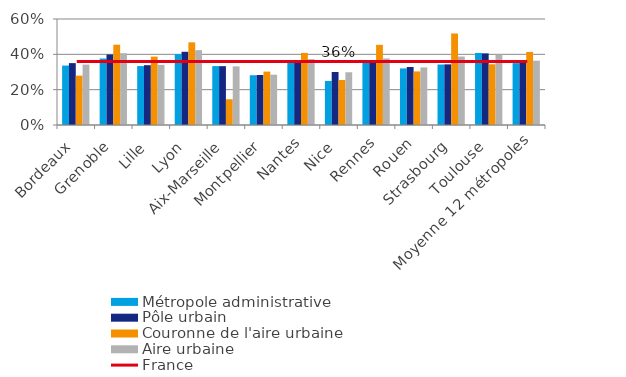
| Category | Métropole administrative | Pôle urbain | Couronne de l'aire urbaine | Aire urbaine |
|---|---|---|---|---|
| Bordeaux | 0.336 | 0.35 | 0.279 | 0.342 |
| Grenoble | 0.376 | 0.399 | 0.454 | 0.406 |
| Lille | 0.334 | 0.339 | 0.387 | 0.34 |
| Lyon | 0.401 | 0.414 | 0.468 | 0.424 |
| Aix-Marseille | 0.333 | 0.333 | 0.146 | 0.332 |
| Montpellier | 0.282 | 0.283 | 0.302 | 0.285 |
| Nantes | 0.366 | 0.366 | 0.408 | 0.373 |
| Nice | 0.249 | 0.3 | 0.255 | 0.299 |
| Rennes | 0.359 | 0.359 | 0.454 | 0.377 |
| Rouen | 0.32 | 0.328 | 0.303 | 0.326 |
| Strasbourg | 0.342 | 0.343 | 0.518 | 0.388 |
| Toulouse | 0.408 | 0.405 | 0.344 | 0.398 |
| Moyenne 12 métropoles | 0.35 | 0.358 | 0.414 | 0.364 |